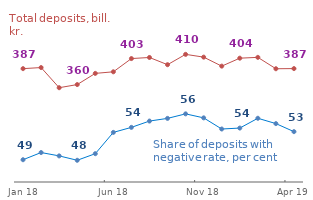
| Category | Series 0 |
|---|---|
| 2018-01-01 | 48.524 |
| 2018-02-01 | 49.661 |
| 2018-03-01 | 49.131 |
| 2018-04-01 | 48.437 |
| 2018-05-01 | 49.48 |
| 2018-06-01 | 52.85 |
| 2018-07-01 | 53.645 |
| 2018-08-01 | 54.643 |
| 2018-09-01 | 55.066 |
| 2018-10-01 | 55.781 |
| 2018-11-01 | 55.149 |
| 2018-12-01 | 53.384 |
| 2019-01-01 | 53.534 |
| 2019-02-01 | 55.084 |
| 2019-03-01 | 54.239 |
| 2019-04-01 | 52.967 |